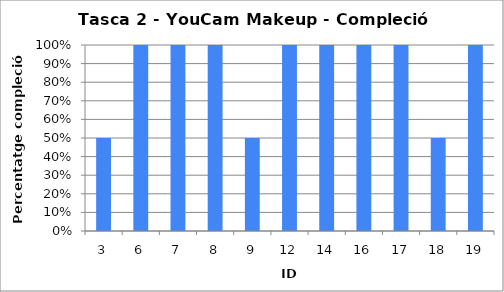
| Category | Percentatge de compleció (%) |
|---|---|
| 3.0 | 0.5 |
| 6.0 | 1 |
| 7.0 | 1 |
| 8.0 | 1 |
| 9.0 | 0.5 |
| 12.0 | 1 |
| 14.0 | 1 |
| 16.0 | 1 |
| 17.0 | 1 |
| 18.0 | 0.5 |
| 19.0 | 1 |